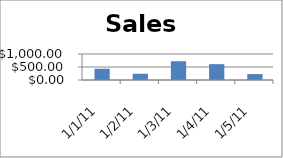
| Category | Sales |
|---|---|
| 1/1/11 | 432 |
| 1/2/11 | 240 |
| 1/3/11 | 722 |
| 1/4/11 | 609 |
| 1/5/11 | 228 |